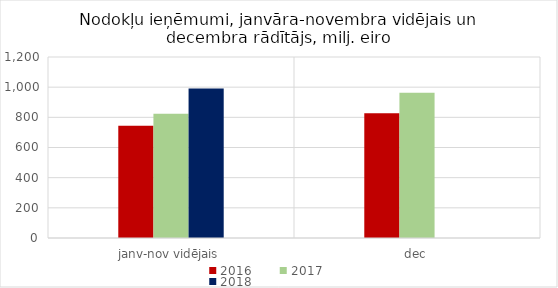
| Category | 2016 | 2017 | 2018 |
|---|---|---|---|
| janv-nov vidējais | 743640.949 | 824369.827 | 990745.049 |
| dec | 826496.37 | 962936.043 | 0 |